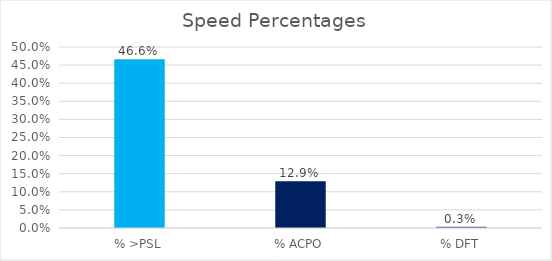
| Category | Series 0 |
|---|---|
| % >PSL | 0.466 |
| % ACPO | 0.129 |
| % DFT | 0.003 |